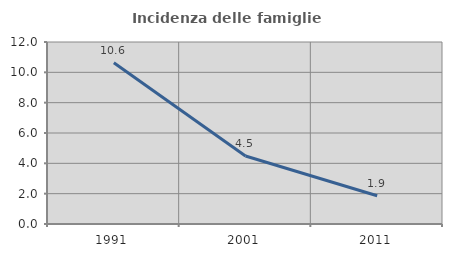
| Category | Incidenza delle famiglie numerose |
|---|---|
| 1991.0 | 10.629 |
| 2001.0 | 4.48 |
| 2011.0 | 1.859 |